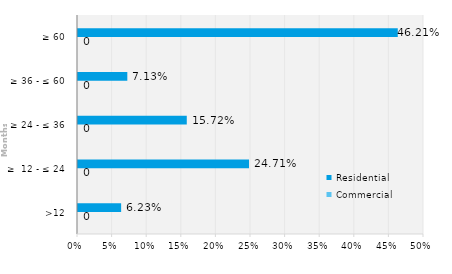
| Category | Commercial | Residential |
|---|---|---|
| >12 | 0 | 0.062 |
| ≥  12 - ≤ 24 | 0 | 0.247 |
| ≥ 24 - ≤ 36 | 0 | 0.157 |
| ≥ 36 - ≤ 60 | 0 | 0.071 |
| ≥ 60 | 0 | 0.462 |